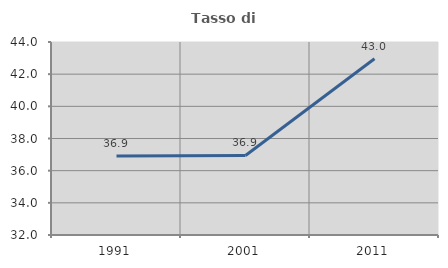
| Category | Tasso di occupazione   |
|---|---|
| 1991.0 | 36.911 |
| 2001.0 | 36.945 |
| 2011.0 | 42.956 |